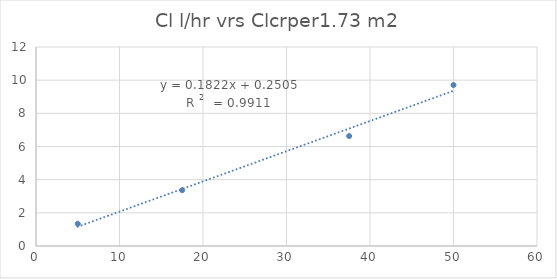
| Category | Series 0 |
|---|---|
| 50.0 | 9.708 |
| 37.5 | 6.631 |
| 17.5 | 3.365 |
| 5.0 | 1.341 |